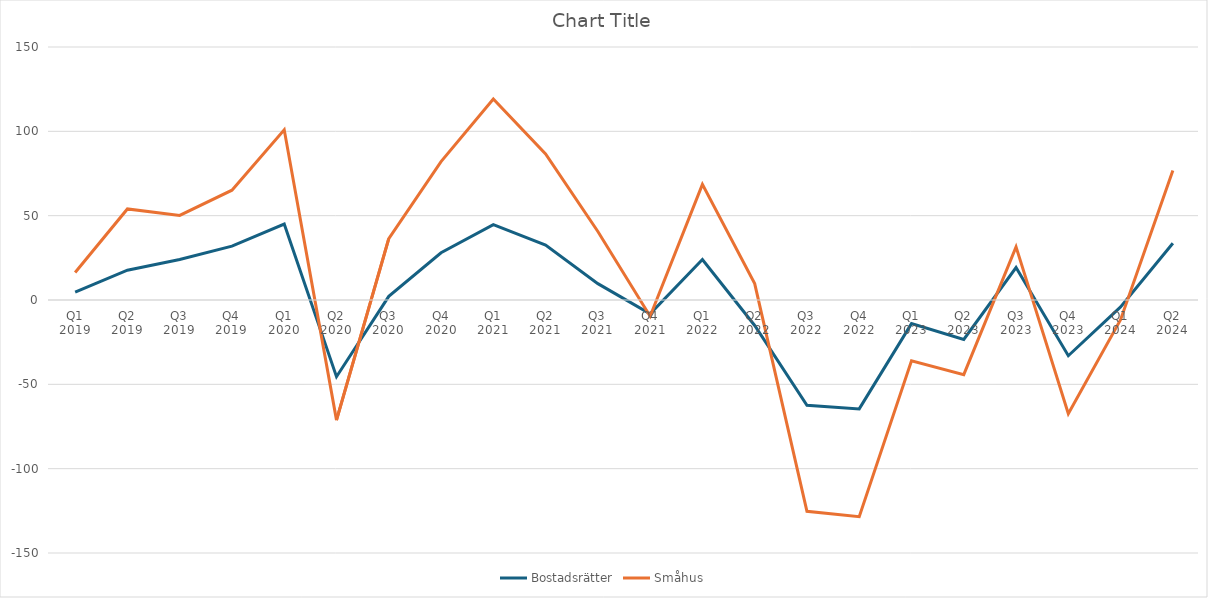
| Category | Bostadsrätter | Småhus |
|---|---|---|
| Q1 2019 | 4.732 | 11.572 |
| Q2 2019 | 17.684 | 36.306 |
| Q3 2019 | 24.043 | 26.105 |
| Q4 2019 | 31.961 | 33.155 |
| Q1 2020 | 45.003 | 55.936 |
| Q2 2020 | -45.473 | -25.756 |
| Q3 2020 | 2.188 | 34.226 |
| Q4 2020 | 28.021 | 54.006 |
| Q1 2021 | 44.697 | 74.509 |
| Q2 2021 | 32.601 | 53.941 |
| Q3 2021 | 9.696 | 30.898 |
| Q4 2021 | -8.171 | -1.466 |
| Q1 2022 | 23.988 | 44.552 |
| Q2 2022 | -15.095 | 9.718 |
| Q3 2022 | -62.444 | -62.804 |
| Q4 2022 | -64.563 | -63.92 |
| Q1 2023 | -14 | -22 |
| Q2 2023 | -23.362 | -20.872 |
| Q3 2023 | 19.247 | 12.232 |
| Q4 2023 | -33.049 | -34.314 |
| Q1 2024 | -4.13 | -7.539 |
| Q2 2024 | 33.617 | 43.227 |